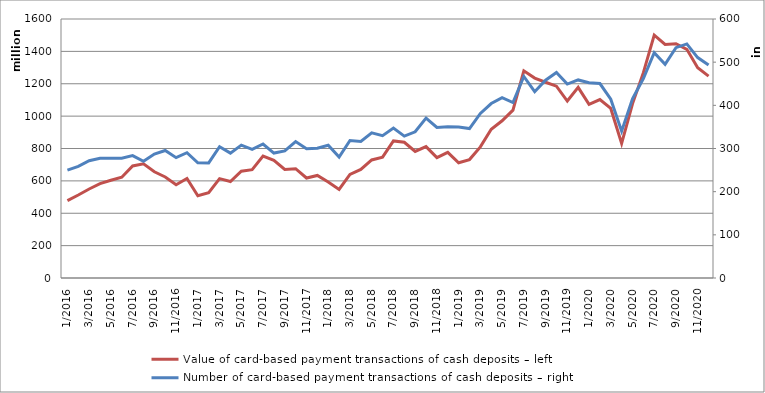
| Category | Value of card-based payment transactions of cash deposits – left |
|---|---|
| 1/2016 | 478170461 |
| 2/2016 | 512639713 |
| 3/2016 | 549693473 |
| 4/2016 | 582699966 |
| 5/2016 | 604174778 |
| 6/2016 | 622450135 |
| 7/2016 | 692048756 |
| 8/2016 | 705028115 |
| 9/2016 | 656237175 |
| 10/2016 | 623918776 |
| 11/2016 | 576348944 |
| 12/2016 | 614910660 |
| 1/2017 | 508412726 |
| 2/2017 | 526671084 |
| 3/2017 | 613709645 |
| 4/2017 | 595689390 |
| 5/2017 | 660001053 |
| 6/2017 | 669163059 |
| 7/2017 | 752679258 |
| 8/2017 | 726381733 |
| 9/2017 | 670881190 |
| 10/2017 | 675163013 |
| 11/2017 | 617721565 |
| 12/2017 | 633509667 |
| 1/2018 | 593537981 |
| 2/2018 | 546771376 |
| 3/2018 | 640220334 |
| 4/2018 | 670424716 |
| 5/2018 | 729402406 |
| 6/2018 | 746835020 |
| 7/2018 | 846583207 |
| 8/2018 | 838599137 |
| 9/2018 | 781815328 |
| 10/2018 | 811370008 |
| 11/2018 | 743921866 |
| 12/2018 | 775906947 |
| 1/2019 | 712063577 |
| 2/2019 | 731526323 |
| 3/2019 | 809962786 |
| 4/2019 | 918558884 |
| 5/2019 | 971331588 |
| 6/2019 | 1037259537 |
| 7/2019 | 1280040384 |
| 8/2019 | 1235110215 |
| 9/2019 | 1209231103 |
| 10/2019 | 1185027154 |
| 11/2019 | 1093111411 |
| 12/2019 | 1177787327 |
| 1/2020 | 1072952586 |
| 2/2020 | 1102338502 |
| 3/2020 | 1047502957 |
| 4/2020 | 830776856 |
| 5/2020 | 1075984510 |
| 6/2020 | 1268477080 |
| 7/2020 | 1499928031 |
| 8/2020 | 1443089385 |
| 9/2020 | 1447095614 |
| 10/2020 | 1412786570 |
| 11/2020 | 1299232880 |
| 12/2020 | 1247037225 |